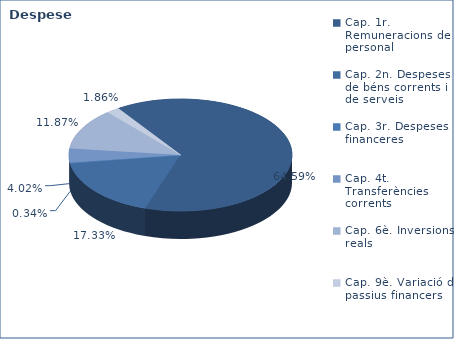
| Category | Series 0 |
|---|---|
| Cap. 1r. Remuneracions de personal | 177512776 |
| Cap. 2n. Despeses de béns corrents i de serveis | 47626649 |
| Cap. 3r. Despeses financeres | 923737 |
| Cap. 4t. Transferències corrents | 11040528 |
| Cap. 6è. Inversions reals | 32619542 |
| Cap. 9è. Variació de passius financers | 5125143 |